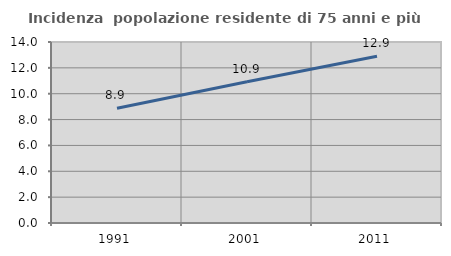
| Category | Incidenza  popolazione residente di 75 anni e più |
|---|---|
| 1991.0 | 8.879 |
| 2001.0 | 10.919 |
| 2011.0 | 12.899 |